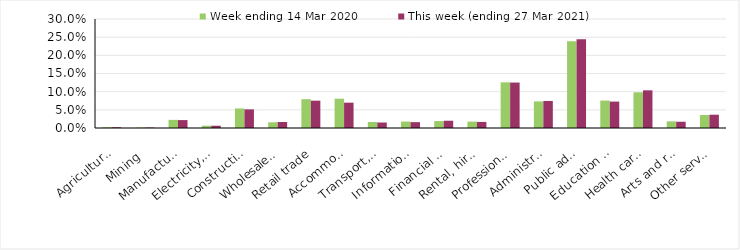
| Category | Week ending 14 Mar 2020 | This week (ending 27 Mar 2021) |
|---|---|---|
| Agriculture, forestry and fishing | 0.002 | 0.002 |
| Mining | 0.001 | 0.001 |
| Manufacturing | 0.022 | 0.022 |
| Electricity, gas, water and waste services | 0.006 | 0.006 |
| Construction | 0.054 | 0.051 |
| Wholesale trade | 0.016 | 0.017 |
| Retail trade | 0.079 | 0.075 |
| Accommodation and food services | 0.081 | 0.07 |
| Transport, postal and warehousing | 0.017 | 0.015 |
| Information media and telecommunications | 0.018 | 0.016 |
| Financial and insurance services | 0.019 | 0.02 |
| Rental, hiring and real estate services | 0.018 | 0.017 |
| Professional, scientific and technical services | 0.126 | 0.125 |
| Administrative and support services | 0.073 | 0.074 |
| Public administration and safety | 0.239 | 0.244 |
| Education and training | 0.076 | 0.073 |
| Health care and social assistance | 0.098 | 0.104 |
| Arts and recreation services | 0.018 | 0.017 |
| Other services | 0.036 | 0.037 |